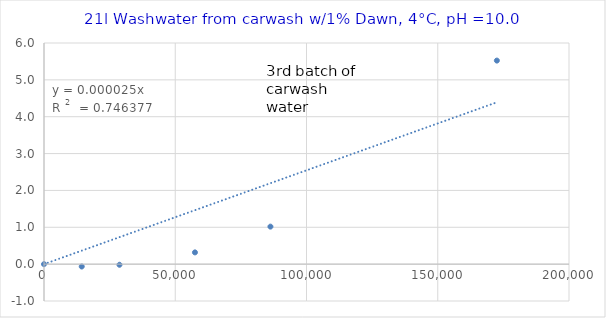
| Category | Series 0 |
|---|---|
| 0.0 | 0 |
| 14376.675603217156 | -0.064 |
| 28753.351206434312 | -0.017 |
| 57506.702412868624 | 0.319 |
| 86260.05361930294 | 1.018 |
| 172520.10723860588 | 5.523 |